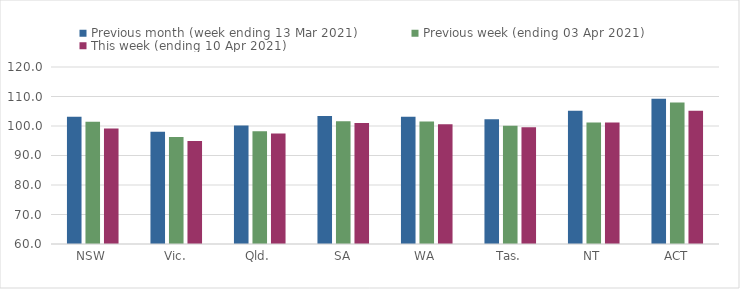
| Category | Previous month (week ending 13 Mar 2021) | Previous week (ending 03 Apr 2021) | This week (ending 10 Apr 2021) |
|---|---|---|---|
| NSW | 103.1 | 101.43 | 99.15 |
| Vic. | 98.09 | 96.23 | 94.91 |
| Qld. | 100.2 | 98.22 | 97.46 |
| SA | 103.43 | 101.63 | 100.98 |
| WA | 103.17 | 101.5 | 100.63 |
| Tas. | 102.32 | 100.07 | 99.56 |
| NT | 105.21 | 101.17 | 101.19 |
| ACT | 109.21 | 107.93 | 105.18 |